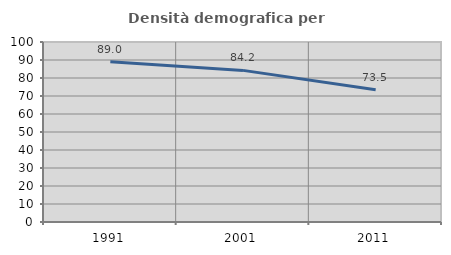
| Category | Densità demografica |
|---|---|
| 1991.0 | 89.026 |
| 2001.0 | 84.228 |
| 2011.0 | 73.472 |